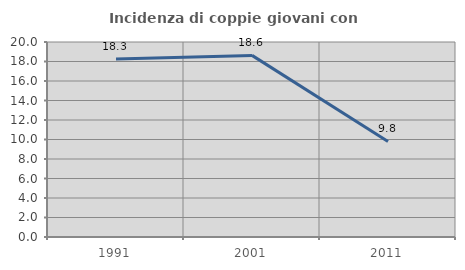
| Category | Incidenza di coppie giovani con figli |
|---|---|
| 1991.0 | 18.254 |
| 2001.0 | 18.627 |
| 2011.0 | 9.804 |